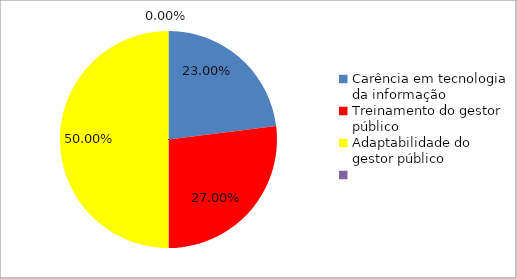
| Category | Series 0 |
|---|---|
| Carência em tecnologia da informação | 0.23 |
| Treinamento do gestor público | 0.27 |
| Adaptabilidade do gestor público | 0.5 |